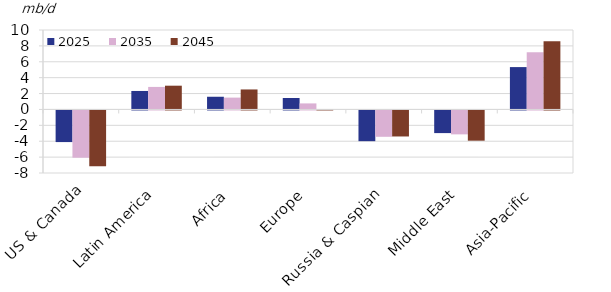
| Category | 2025 | 2035 | 2045 |
|---|---|---|---|
| US & Canada | -3.982 | -5.948 | -7.023 |
| Latin America | 2.326 | 2.835 | 2.99 |
| Africa | 1.598 | 1.49 | 2.517 |
| Europe | 1.443 | 0.76 | 0.027 |
| Russia & Caspian | -3.867 | -3.317 | -3.276 |
| Middle East | -2.851 | -3.011 | -3.807 |
| Asia-Pacific | 5.331 | 7.186 | 8.576 |